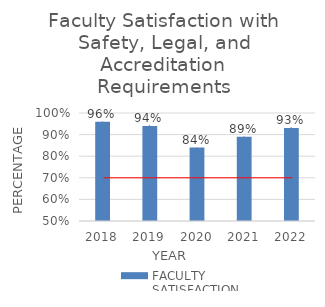
| Category | FACULTY SATISFACTION |
|---|---|
| 0 | 0.96 |
| 1 | 0.94 |
| 2 | 0.84 |
| 3 | 0.89 |
| 4 | 0.93 |